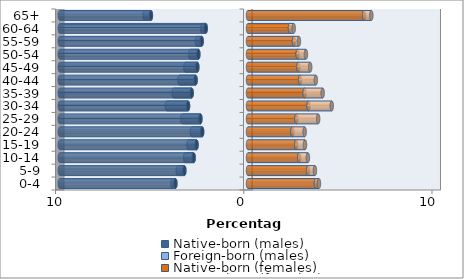
| Category | Native-born (males) | Foreign-born (males) | Native-born (females) | Foreign-born (females) |
|---|---|---|---|---|
| 0-4 | -3.856 | -0.155 | 3.604 | 0.164 |
| 5-9 | -3.382 | -0.35 | 3.19 | 0.365 |
| 10-14 | -2.887 | -0.452 | 2.716 | 0.465 |
| 15-19 | -2.734 | -0.427 | 2.558 | 0.47 |
| 20-24 | -2.436 | -0.545 | 2.355 | 0.654 |
| 25-29 | -2.528 | -0.966 | 2.568 | 1.16 |
| 30-34 | -3.185 | -1.129 | 3.216 | 1.233 |
| 35-39 | -2.992 | -0.956 | 3.006 | 0.96 |
| 40-44 | -2.785 | -0.855 | 2.766 | 0.837 |
| 45-49 | -2.692 | -0.636 | 2.674 | 0.629 |
| 50-54 | -2.638 | -0.431 | 2.637 | 0.439 |
| 55-59 | -2.461 | -0.255 | 2.44 | 0.265 |
| 60-64 | -2.247 | -0.182 | 2.228 | 0.199 |
| 65+ | -5.158 | -0.331 | 6.167 | 0.384 |